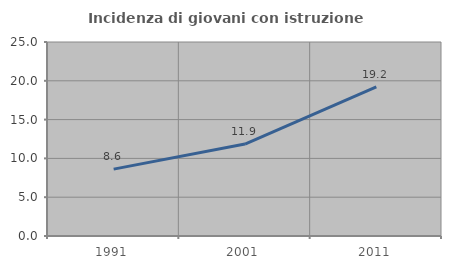
| Category | Incidenza di giovani con istruzione universitaria |
|---|---|
| 1991.0 | 8.621 |
| 2001.0 | 11.852 |
| 2011.0 | 19.231 |